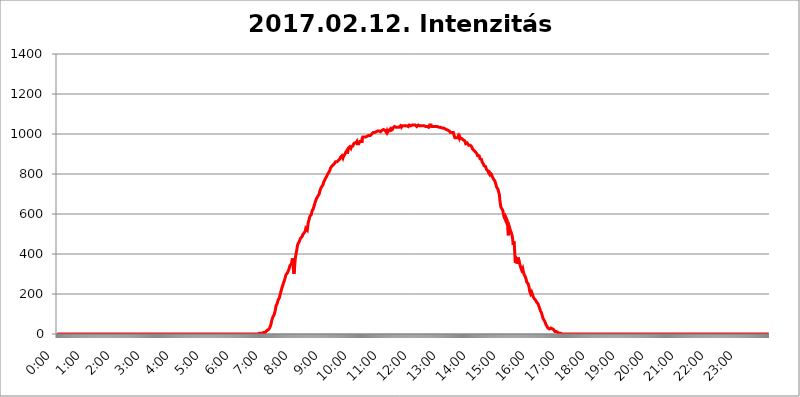
| Category | 2017.02.12. Intenzitás [W/m^2] |
|---|---|
| 0.0 | 0 |
| 0.0006944444444444445 | 0 |
| 0.001388888888888889 | 0 |
| 0.0020833333333333333 | 0 |
| 0.002777777777777778 | 0 |
| 0.003472222222222222 | 0 |
| 0.004166666666666667 | 0 |
| 0.004861111111111111 | 0 |
| 0.005555555555555556 | 0 |
| 0.0062499999999999995 | 0 |
| 0.006944444444444444 | 0 |
| 0.007638888888888889 | 0 |
| 0.008333333333333333 | 0 |
| 0.009027777777777779 | 0 |
| 0.009722222222222222 | 0 |
| 0.010416666666666666 | 0 |
| 0.011111111111111112 | 0 |
| 0.011805555555555555 | 0 |
| 0.012499999999999999 | 0 |
| 0.013194444444444444 | 0 |
| 0.013888888888888888 | 0 |
| 0.014583333333333332 | 0 |
| 0.015277777777777777 | 0 |
| 0.015972222222222224 | 0 |
| 0.016666666666666666 | 0 |
| 0.017361111111111112 | 0 |
| 0.018055555555555557 | 0 |
| 0.01875 | 0 |
| 0.019444444444444445 | 0 |
| 0.02013888888888889 | 0 |
| 0.020833333333333332 | 0 |
| 0.02152777777777778 | 0 |
| 0.022222222222222223 | 0 |
| 0.02291666666666667 | 0 |
| 0.02361111111111111 | 0 |
| 0.024305555555555556 | 0 |
| 0.024999999999999998 | 0 |
| 0.025694444444444447 | 0 |
| 0.02638888888888889 | 0 |
| 0.027083333333333334 | 0 |
| 0.027777777777777776 | 0 |
| 0.02847222222222222 | 0 |
| 0.029166666666666664 | 0 |
| 0.029861111111111113 | 0 |
| 0.030555555555555555 | 0 |
| 0.03125 | 0 |
| 0.03194444444444445 | 0 |
| 0.03263888888888889 | 0 |
| 0.03333333333333333 | 0 |
| 0.034027777777777775 | 0 |
| 0.034722222222222224 | 0 |
| 0.035416666666666666 | 0 |
| 0.036111111111111115 | 0 |
| 0.03680555555555556 | 0 |
| 0.0375 | 0 |
| 0.03819444444444444 | 0 |
| 0.03888888888888889 | 0 |
| 0.03958333333333333 | 0 |
| 0.04027777777777778 | 0 |
| 0.04097222222222222 | 0 |
| 0.041666666666666664 | 0 |
| 0.042361111111111106 | 0 |
| 0.04305555555555556 | 0 |
| 0.043750000000000004 | 0 |
| 0.044444444444444446 | 0 |
| 0.04513888888888889 | 0 |
| 0.04583333333333334 | 0 |
| 0.04652777777777778 | 0 |
| 0.04722222222222222 | 0 |
| 0.04791666666666666 | 0 |
| 0.04861111111111111 | 0 |
| 0.049305555555555554 | 0 |
| 0.049999999999999996 | 0 |
| 0.05069444444444445 | 0 |
| 0.051388888888888894 | 0 |
| 0.052083333333333336 | 0 |
| 0.05277777777777778 | 0 |
| 0.05347222222222222 | 0 |
| 0.05416666666666667 | 0 |
| 0.05486111111111111 | 0 |
| 0.05555555555555555 | 0 |
| 0.05625 | 0 |
| 0.05694444444444444 | 0 |
| 0.057638888888888885 | 0 |
| 0.05833333333333333 | 0 |
| 0.05902777777777778 | 0 |
| 0.059722222222222225 | 0 |
| 0.06041666666666667 | 0 |
| 0.061111111111111116 | 0 |
| 0.06180555555555556 | 0 |
| 0.0625 | 0 |
| 0.06319444444444444 | 0 |
| 0.06388888888888888 | 0 |
| 0.06458333333333334 | 0 |
| 0.06527777777777778 | 0 |
| 0.06597222222222222 | 0 |
| 0.06666666666666667 | 0 |
| 0.06736111111111111 | 0 |
| 0.06805555555555555 | 0 |
| 0.06874999999999999 | 0 |
| 0.06944444444444443 | 0 |
| 0.07013888888888889 | 0 |
| 0.07083333333333333 | 0 |
| 0.07152777777777779 | 0 |
| 0.07222222222222223 | 0 |
| 0.07291666666666667 | 0 |
| 0.07361111111111111 | 0 |
| 0.07430555555555556 | 0 |
| 0.075 | 0 |
| 0.07569444444444444 | 0 |
| 0.0763888888888889 | 0 |
| 0.07708333333333334 | 0 |
| 0.07777777777777778 | 0 |
| 0.07847222222222222 | 0 |
| 0.07916666666666666 | 0 |
| 0.0798611111111111 | 0 |
| 0.08055555555555556 | 0 |
| 0.08125 | 0 |
| 0.08194444444444444 | 0 |
| 0.08263888888888889 | 0 |
| 0.08333333333333333 | 0 |
| 0.08402777777777777 | 0 |
| 0.08472222222222221 | 0 |
| 0.08541666666666665 | 0 |
| 0.08611111111111112 | 0 |
| 0.08680555555555557 | 0 |
| 0.08750000000000001 | 0 |
| 0.08819444444444445 | 0 |
| 0.08888888888888889 | 0 |
| 0.08958333333333333 | 0 |
| 0.09027777777777778 | 0 |
| 0.09097222222222222 | 0 |
| 0.09166666666666667 | 0 |
| 0.09236111111111112 | 0 |
| 0.09305555555555556 | 0 |
| 0.09375 | 0 |
| 0.09444444444444444 | 0 |
| 0.09513888888888888 | 0 |
| 0.09583333333333333 | 0 |
| 0.09652777777777777 | 0 |
| 0.09722222222222222 | 0 |
| 0.09791666666666667 | 0 |
| 0.09861111111111111 | 0 |
| 0.09930555555555555 | 0 |
| 0.09999999999999999 | 0 |
| 0.10069444444444443 | 0 |
| 0.1013888888888889 | 0 |
| 0.10208333333333335 | 0 |
| 0.10277777777777779 | 0 |
| 0.10347222222222223 | 0 |
| 0.10416666666666667 | 0 |
| 0.10486111111111111 | 0 |
| 0.10555555555555556 | 0 |
| 0.10625 | 0 |
| 0.10694444444444444 | 0 |
| 0.1076388888888889 | 0 |
| 0.10833333333333334 | 0 |
| 0.10902777777777778 | 0 |
| 0.10972222222222222 | 0 |
| 0.1111111111111111 | 0 |
| 0.11180555555555556 | 0 |
| 0.11180555555555556 | 0 |
| 0.1125 | 0 |
| 0.11319444444444444 | 0 |
| 0.11388888888888889 | 0 |
| 0.11458333333333333 | 0 |
| 0.11527777777777777 | 0 |
| 0.11597222222222221 | 0 |
| 0.11666666666666665 | 0 |
| 0.1173611111111111 | 0 |
| 0.11805555555555557 | 0 |
| 0.11944444444444445 | 0 |
| 0.12013888888888889 | 0 |
| 0.12083333333333333 | 0 |
| 0.12152777777777778 | 0 |
| 0.12222222222222223 | 0 |
| 0.12291666666666667 | 0 |
| 0.12291666666666667 | 0 |
| 0.12361111111111112 | 0 |
| 0.12430555555555556 | 0 |
| 0.125 | 0 |
| 0.12569444444444444 | 0 |
| 0.12638888888888888 | 0 |
| 0.12708333333333333 | 0 |
| 0.16875 | 0 |
| 0.12847222222222224 | 0 |
| 0.12916666666666668 | 0 |
| 0.12986111111111112 | 0 |
| 0.13055555555555556 | 0 |
| 0.13125 | 0 |
| 0.13194444444444445 | 0 |
| 0.1326388888888889 | 0 |
| 0.13333333333333333 | 0 |
| 0.13402777777777777 | 0 |
| 0.13402777777777777 | 0 |
| 0.13472222222222222 | 0 |
| 0.13541666666666666 | 0 |
| 0.1361111111111111 | 0 |
| 0.13749999999999998 | 0 |
| 0.13819444444444443 | 0 |
| 0.1388888888888889 | 0 |
| 0.13958333333333334 | 0 |
| 0.14027777777777778 | 0 |
| 0.14097222222222222 | 0 |
| 0.14166666666666666 | 0 |
| 0.1423611111111111 | 0 |
| 0.14305555555555557 | 0 |
| 0.14375000000000002 | 0 |
| 0.14444444444444446 | 0 |
| 0.1451388888888889 | 0 |
| 0.1451388888888889 | 0 |
| 0.14652777777777778 | 0 |
| 0.14722222222222223 | 0 |
| 0.14791666666666667 | 0 |
| 0.1486111111111111 | 0 |
| 0.14930555555555555 | 0 |
| 0.15 | 0 |
| 0.15069444444444444 | 0 |
| 0.15138888888888888 | 0 |
| 0.15208333333333332 | 0 |
| 0.15277777777777776 | 0 |
| 0.15347222222222223 | 0 |
| 0.15416666666666667 | 0 |
| 0.15486111111111112 | 0 |
| 0.15555555555555556 | 0 |
| 0.15625 | 0 |
| 0.15694444444444444 | 0 |
| 0.15763888888888888 | 0 |
| 0.15833333333333333 | 0 |
| 0.15902777777777777 | 0 |
| 0.15972222222222224 | 0 |
| 0.16041666666666668 | 0 |
| 0.16111111111111112 | 0 |
| 0.16180555555555556 | 0 |
| 0.1625 | 0 |
| 0.16319444444444445 | 0 |
| 0.1638888888888889 | 0 |
| 0.16458333333333333 | 0 |
| 0.16527777777777777 | 0 |
| 0.16597222222222222 | 0 |
| 0.16666666666666666 | 0 |
| 0.1673611111111111 | 0 |
| 0.16805555555555554 | 0 |
| 0.16874999999999998 | 0 |
| 0.16944444444444443 | 0 |
| 0.17013888888888887 | 0 |
| 0.1708333333333333 | 0 |
| 0.17152777777777775 | 0 |
| 0.17222222222222225 | 0 |
| 0.1729166666666667 | 0 |
| 0.17361111111111113 | 0 |
| 0.17430555555555557 | 0 |
| 0.17500000000000002 | 0 |
| 0.17569444444444446 | 0 |
| 0.1763888888888889 | 0 |
| 0.17708333333333334 | 0 |
| 0.17777777777777778 | 0 |
| 0.17847222222222223 | 0 |
| 0.17916666666666667 | 0 |
| 0.1798611111111111 | 0 |
| 0.18055555555555555 | 0 |
| 0.18125 | 0 |
| 0.18194444444444444 | 0 |
| 0.1826388888888889 | 0 |
| 0.18333333333333335 | 0 |
| 0.1840277777777778 | 0 |
| 0.18472222222222223 | 0 |
| 0.18541666666666667 | 0 |
| 0.18611111111111112 | 0 |
| 0.18680555555555556 | 0 |
| 0.1875 | 0 |
| 0.18819444444444444 | 0 |
| 0.18888888888888888 | 0 |
| 0.18958333333333333 | 0 |
| 0.19027777777777777 | 0 |
| 0.1909722222222222 | 0 |
| 0.19166666666666665 | 0 |
| 0.19236111111111112 | 0 |
| 0.19305555555555554 | 0 |
| 0.19375 | 0 |
| 0.19444444444444445 | 0 |
| 0.1951388888888889 | 0 |
| 0.19583333333333333 | 0 |
| 0.19652777777777777 | 0 |
| 0.19722222222222222 | 0 |
| 0.19791666666666666 | 0 |
| 0.1986111111111111 | 0 |
| 0.19930555555555554 | 0 |
| 0.19999999999999998 | 0 |
| 0.20069444444444443 | 0 |
| 0.20138888888888887 | 0 |
| 0.2020833333333333 | 0 |
| 0.2027777777777778 | 0 |
| 0.2034722222222222 | 0 |
| 0.2041666666666667 | 0 |
| 0.20486111111111113 | 0 |
| 0.20555555555555557 | 0 |
| 0.20625000000000002 | 0 |
| 0.20694444444444446 | 0 |
| 0.2076388888888889 | 0 |
| 0.20833333333333334 | 0 |
| 0.20902777777777778 | 0 |
| 0.20972222222222223 | 0 |
| 0.21041666666666667 | 0 |
| 0.2111111111111111 | 0 |
| 0.21180555555555555 | 0 |
| 0.2125 | 0 |
| 0.21319444444444444 | 0 |
| 0.2138888888888889 | 0 |
| 0.21458333333333335 | 0 |
| 0.2152777777777778 | 0 |
| 0.21597222222222223 | 0 |
| 0.21666666666666667 | 0 |
| 0.21736111111111112 | 0 |
| 0.21805555555555556 | 0 |
| 0.21875 | 0 |
| 0.21944444444444444 | 0 |
| 0.22013888888888888 | 0 |
| 0.22083333333333333 | 0 |
| 0.22152777777777777 | 0 |
| 0.2222222222222222 | 0 |
| 0.22291666666666665 | 0 |
| 0.2236111111111111 | 0 |
| 0.22430555555555556 | 0 |
| 0.225 | 0 |
| 0.22569444444444445 | 0 |
| 0.2263888888888889 | 0 |
| 0.22708333333333333 | 0 |
| 0.22777777777777777 | 0 |
| 0.22847222222222222 | 0 |
| 0.22916666666666666 | 0 |
| 0.2298611111111111 | 0 |
| 0.23055555555555554 | 0 |
| 0.23124999999999998 | 0 |
| 0.23194444444444443 | 0 |
| 0.23263888888888887 | 0 |
| 0.2333333333333333 | 0 |
| 0.2340277777777778 | 0 |
| 0.2347222222222222 | 0 |
| 0.2354166666666667 | 0 |
| 0.23611111111111113 | 0 |
| 0.23680555555555557 | 0 |
| 0.23750000000000002 | 0 |
| 0.23819444444444446 | 0 |
| 0.2388888888888889 | 0 |
| 0.23958333333333334 | 0 |
| 0.24027777777777778 | 0 |
| 0.24097222222222223 | 0 |
| 0.24166666666666667 | 0 |
| 0.2423611111111111 | 0 |
| 0.24305555555555555 | 0 |
| 0.24375 | 0 |
| 0.24444444444444446 | 0 |
| 0.24513888888888888 | 0 |
| 0.24583333333333335 | 0 |
| 0.2465277777777778 | 0 |
| 0.24722222222222223 | 0 |
| 0.24791666666666667 | 0 |
| 0.24861111111111112 | 0 |
| 0.24930555555555556 | 0 |
| 0.25 | 0 |
| 0.25069444444444444 | 0 |
| 0.2513888888888889 | 0 |
| 0.2520833333333333 | 0 |
| 0.25277777777777777 | 0 |
| 0.2534722222222222 | 0 |
| 0.25416666666666665 | 0 |
| 0.2548611111111111 | 0 |
| 0.2555555555555556 | 0 |
| 0.25625000000000003 | 0 |
| 0.2569444444444445 | 0 |
| 0.2576388888888889 | 0 |
| 0.25833333333333336 | 0 |
| 0.2590277777777778 | 0 |
| 0.25972222222222224 | 0 |
| 0.2604166666666667 | 0 |
| 0.2611111111111111 | 0 |
| 0.26180555555555557 | 0 |
| 0.2625 | 0 |
| 0.26319444444444445 | 0 |
| 0.2638888888888889 | 0 |
| 0.26458333333333334 | 0 |
| 0.2652777777777778 | 0 |
| 0.2659722222222222 | 0 |
| 0.26666666666666666 | 0 |
| 0.2673611111111111 | 0 |
| 0.26805555555555555 | 0 |
| 0.26875 | 0 |
| 0.26944444444444443 | 0 |
| 0.2701388888888889 | 0 |
| 0.2708333333333333 | 0 |
| 0.27152777777777776 | 0 |
| 0.2722222222222222 | 0 |
| 0.27291666666666664 | 0 |
| 0.2736111111111111 | 0 |
| 0.2743055555555555 | 0 |
| 0.27499999999999997 | 0 |
| 0.27569444444444446 | 0 |
| 0.27638888888888885 | 0 |
| 0.27708333333333335 | 0 |
| 0.2777777777777778 | 0 |
| 0.27847222222222223 | 0 |
| 0.2791666666666667 | 0 |
| 0.2798611111111111 | 0 |
| 0.28055555555555556 | 0 |
| 0.28125 | 0 |
| 0.28194444444444444 | 3.525 |
| 0.2826388888888889 | 3.525 |
| 0.2833333333333333 | 3.525 |
| 0.28402777777777777 | 3.525 |
| 0.2847222222222222 | 3.525 |
| 0.28541666666666665 | 3.525 |
| 0.28611111111111115 | 3.525 |
| 0.28680555555555554 | 3.525 |
| 0.28750000000000003 | 3.525 |
| 0.2881944444444445 | 3.525 |
| 0.2888888888888889 | 3.525 |
| 0.28958333333333336 | 7.887 |
| 0.2902777777777778 | 7.887 |
| 0.29097222222222224 | 7.887 |
| 0.2916666666666667 | 7.887 |
| 0.2923611111111111 | 12.257 |
| 0.29305555555555557 | 12.257 |
| 0.29375 | 16.636 |
| 0.29444444444444445 | 16.636 |
| 0.2951388888888889 | 16.636 |
| 0.29583333333333334 | 21.024 |
| 0.2965277777777778 | 25.419 |
| 0.2972222222222222 | 25.419 |
| 0.29791666666666666 | 29.823 |
| 0.2986111111111111 | 29.823 |
| 0.29930555555555555 | 34.234 |
| 0.3 | 51.951 |
| 0.30069444444444443 | 65.31 |
| 0.3013888888888889 | 74.246 |
| 0.3020833333333333 | 78.722 |
| 0.30277777777777776 | 87.692 |
| 0.3034722222222222 | 92.184 |
| 0.30416666666666664 | 96.682 |
| 0.3048611111111111 | 105.69 |
| 0.3055555555555555 | 114.716 |
| 0.30624999999999997 | 128.284 |
| 0.3069444444444444 | 141.884 |
| 0.3076388888888889 | 146.423 |
| 0.30833333333333335 | 150.964 |
| 0.3090277777777778 | 160.056 |
| 0.30972222222222223 | 169.156 |
| 0.3104166666666667 | 164.605 |
| 0.3111111111111111 | 169.156 |
| 0.31180555555555556 | 182.82 |
| 0.3125 | 196.497 |
| 0.31319444444444444 | 205.62 |
| 0.3138888888888889 | 210.182 |
| 0.3145833333333333 | 223.873 |
| 0.31527777777777777 | 233 |
| 0.3159722222222222 | 237.564 |
| 0.31666666666666665 | 246.689 |
| 0.31736111111111115 | 255.813 |
| 0.31805555555555554 | 260.373 |
| 0.31875000000000003 | 269.49 |
| 0.3194444444444445 | 278.603 |
| 0.3201388888888889 | 287.709 |
| 0.32083333333333336 | 296.808 |
| 0.3215277777777778 | 296.808 |
| 0.32222222222222224 | 301.354 |
| 0.3229166666666667 | 305.898 |
| 0.3236111111111111 | 305.898 |
| 0.32430555555555557 | 310.44 |
| 0.325 | 324.052 |
| 0.32569444444444445 | 333.113 |
| 0.3263888888888889 | 342.162 |
| 0.32708333333333334 | 342.162 |
| 0.3277777777777778 | 342.162 |
| 0.3284722222222222 | 351.198 |
| 0.32916666666666666 | 364.728 |
| 0.3298611111111111 | 378.224 |
| 0.33055555555555555 | 364.728 |
| 0.33125 | 319.517 |
| 0.33194444444444443 | 301.354 |
| 0.3326388888888889 | 319.517 |
| 0.3333333333333333 | 355.712 |
| 0.3340277777777778 | 382.715 |
| 0.3347222222222222 | 396.164 |
| 0.3354166666666667 | 409.574 |
| 0.3361111111111111 | 422.943 |
| 0.3368055555555556 | 440.702 |
| 0.33749999999999997 | 449.551 |
| 0.33819444444444446 | 453.968 |
| 0.33888888888888885 | 453.968 |
| 0.33958333333333335 | 462.786 |
| 0.34027777777777773 | 471.582 |
| 0.34097222222222223 | 475.972 |
| 0.3416666666666666 | 480.356 |
| 0.3423611111111111 | 480.356 |
| 0.3430555555555555 | 484.735 |
| 0.34375 | 489.108 |
| 0.3444444444444445 | 497.836 |
| 0.3451388888888889 | 502.192 |
| 0.3458333333333334 | 502.192 |
| 0.34652777777777777 | 506.542 |
| 0.34722222222222227 | 506.542 |
| 0.34791666666666665 | 515.223 |
| 0.34861111111111115 | 528.2 |
| 0.34930555555555554 | 532.513 |
| 0.35000000000000003 | 523.88 |
| 0.3506944444444444 | 519.555 |
| 0.3513888888888889 | 541.121 |
| 0.3520833333333333 | 558.261 |
| 0.3527777777777778 | 566.793 |
| 0.3534722222222222 | 575.299 |
| 0.3541666666666667 | 588.009 |
| 0.3548611111111111 | 592.233 |
| 0.35555555555555557 | 588.009 |
| 0.35625 | 596.45 |
| 0.35694444444444445 | 609.062 |
| 0.3576388888888889 | 617.436 |
| 0.35833333333333334 | 621.613 |
| 0.3590277777777778 | 625.784 |
| 0.3597222222222222 | 634.105 |
| 0.36041666666666666 | 642.4 |
| 0.3611111111111111 | 650.667 |
| 0.36180555555555555 | 658.909 |
| 0.3625 | 667.123 |
| 0.36319444444444443 | 671.22 |
| 0.3638888888888889 | 679.395 |
| 0.3645833333333333 | 683.473 |
| 0.3652777777777778 | 687.544 |
| 0.3659722222222222 | 687.544 |
| 0.3666666666666667 | 691.608 |
| 0.3673611111111111 | 699.717 |
| 0.3680555555555556 | 711.832 |
| 0.36874999999999997 | 719.877 |
| 0.36944444444444446 | 723.889 |
| 0.37013888888888885 | 731.896 |
| 0.37083333333333335 | 735.89 |
| 0.37152777777777773 | 739.877 |
| 0.37222222222222223 | 743.859 |
| 0.3729166666666666 | 747.834 |
| 0.3736111111111111 | 759.723 |
| 0.3743055555555555 | 763.674 |
| 0.375 | 767.62 |
| 0.3756944444444445 | 775.492 |
| 0.3763888888888889 | 775.492 |
| 0.3770833333333334 | 779.42 |
| 0.37777777777777777 | 787.258 |
| 0.37847222222222227 | 791.169 |
| 0.37916666666666665 | 798.974 |
| 0.37986111111111115 | 795.074 |
| 0.38055555555555554 | 806.757 |
| 0.38125000000000003 | 806.757 |
| 0.3819444444444444 | 814.519 |
| 0.3826388888888889 | 822.26 |
| 0.3833333333333333 | 829.981 |
| 0.3840277777777778 | 829.981 |
| 0.3847222222222222 | 837.682 |
| 0.3854166666666667 | 841.526 |
| 0.3861111111111111 | 841.526 |
| 0.38680555555555557 | 845.365 |
| 0.3875 | 845.365 |
| 0.38819444444444445 | 849.199 |
| 0.3888888888888889 | 853.029 |
| 0.38958333333333334 | 853.029 |
| 0.3902777777777778 | 860.676 |
| 0.3909722222222222 | 860.676 |
| 0.39166666666666666 | 860.676 |
| 0.3923611111111111 | 860.676 |
| 0.39305555555555555 | 860.676 |
| 0.39375 | 860.676 |
| 0.39444444444444443 | 868.305 |
| 0.3951388888888889 | 868.305 |
| 0.3958333333333333 | 868.305 |
| 0.3965277777777778 | 875.918 |
| 0.3972222222222222 | 883.516 |
| 0.3979166666666667 | 887.309 |
| 0.3986111111111111 | 887.309 |
| 0.3993055555555556 | 891.099 |
| 0.39999999999999997 | 894.885 |
| 0.40069444444444446 | 879.719 |
| 0.40138888888888885 | 887.309 |
| 0.40208333333333335 | 891.099 |
| 0.40277777777777773 | 894.885 |
| 0.40347222222222223 | 898.668 |
| 0.4041666666666666 | 898.668 |
| 0.4048611111111111 | 909.996 |
| 0.4055555555555555 | 913.766 |
| 0.40625 | 917.534 |
| 0.4069444444444445 | 902.447 |
| 0.4076388888888889 | 913.766 |
| 0.4083333333333334 | 928.819 |
| 0.40902777777777777 | 932.576 |
| 0.40972222222222227 | 932.576 |
| 0.41041666666666665 | 936.33 |
| 0.41111111111111115 | 936.33 |
| 0.41180555555555554 | 928.819 |
| 0.41250000000000003 | 936.33 |
| 0.4131944444444444 | 936.33 |
| 0.4138888888888889 | 936.33 |
| 0.4145833333333333 | 940.082 |
| 0.4152777777777778 | 947.58 |
| 0.4159722222222222 | 951.327 |
| 0.4166666666666667 | 955.071 |
| 0.4173611111111111 | 955.071 |
| 0.41805555555555557 | 955.071 |
| 0.41875 | 955.071 |
| 0.41944444444444445 | 958.814 |
| 0.4201388888888889 | 962.555 |
| 0.42083333333333334 | 951.327 |
| 0.4215277777777778 | 951.327 |
| 0.4222222222222222 | 947.58 |
| 0.42291666666666666 | 951.327 |
| 0.4236111111111111 | 955.071 |
| 0.42430555555555555 | 962.555 |
| 0.425 | 962.555 |
| 0.42569444444444443 | 962.555 |
| 0.4263888888888889 | 962.555 |
| 0.4270833333333333 | 955.071 |
| 0.4277777777777778 | 977.508 |
| 0.4284722222222222 | 984.98 |
| 0.4291666666666667 | 988.714 |
| 0.4298611111111111 | 984.98 |
| 0.4305555555555556 | 984.98 |
| 0.43124999999999997 | 981.244 |
| 0.43194444444444446 | 984.98 |
| 0.43263888888888885 | 984.98 |
| 0.43333333333333335 | 984.98 |
| 0.43402777777777773 | 988.714 |
| 0.43472222222222223 | 988.714 |
| 0.4354166666666666 | 988.714 |
| 0.4361111111111111 | 988.714 |
| 0.4368055555555555 | 992.448 |
| 0.4375 | 992.448 |
| 0.4381944444444445 | 992.448 |
| 0.4388888888888889 | 992.448 |
| 0.4395833333333334 | 992.448 |
| 0.44027777777777777 | 996.182 |
| 0.44097222222222227 | 999.916 |
| 0.44166666666666665 | 999.916 |
| 0.44236111111111115 | 1003.65 |
| 0.44305555555555554 | 1007.383 |
| 0.44375000000000003 | 1007.383 |
| 0.4444444444444444 | 1007.383 |
| 0.4451388888888889 | 1007.383 |
| 0.4458333333333333 | 1007.383 |
| 0.4465277777777778 | 1007.383 |
| 0.4472222222222222 | 1011.118 |
| 0.4479166666666667 | 1011.118 |
| 0.4486111111111111 | 1011.118 |
| 0.44930555555555557 | 1014.852 |
| 0.45 | 1014.852 |
| 0.45069444444444445 | 1014.852 |
| 0.4513888888888889 | 1014.852 |
| 0.45208333333333334 | 1011.118 |
| 0.4527777777777778 | 1011.118 |
| 0.4534722222222222 | 1011.118 |
| 0.45416666666666666 | 1014.852 |
| 0.4548611111111111 | 1014.852 |
| 0.45555555555555555 | 1018.587 |
| 0.45625 | 1018.587 |
| 0.45694444444444443 | 1022.323 |
| 0.4576388888888889 | 1022.323 |
| 0.4583333333333333 | 1018.587 |
| 0.4590277777777778 | 1018.587 |
| 0.4597222222222222 | 1018.587 |
| 0.4604166666666667 | 1014.852 |
| 0.4611111111111111 | 1014.852 |
| 0.4618055555555556 | 1007.383 |
| 0.46249999999999997 | 1014.852 |
| 0.46319444444444446 | 1007.383 |
| 0.46388888888888885 | 1007.383 |
| 0.46458333333333335 | 1011.118 |
| 0.46527777777777773 | 1018.587 |
| 0.46597222222222223 | 1022.323 |
| 0.4666666666666666 | 1022.323 |
| 0.4673611111111111 | 1026.06 |
| 0.4680555555555555 | 1018.587 |
| 0.46875 | 1022.323 |
| 0.4694444444444445 | 1022.323 |
| 0.4701388888888889 | 1022.323 |
| 0.4708333333333334 | 1029.798 |
| 0.47152777777777777 | 1029.798 |
| 0.47222222222222227 | 1033.537 |
| 0.47291666666666665 | 1037.277 |
| 0.47361111111111115 | 1033.537 |
| 0.47430555555555554 | 1033.537 |
| 0.47500000000000003 | 1033.537 |
| 0.4756944444444444 | 1033.537 |
| 0.4763888888888889 | 1033.537 |
| 0.4770833333333333 | 1033.537 |
| 0.4777777777777778 | 1033.537 |
| 0.4784722222222222 | 1033.537 |
| 0.4791666666666667 | 1033.537 |
| 0.4798611111111111 | 1037.277 |
| 0.48055555555555557 | 1029.798 |
| 0.48125 | 1041.019 |
| 0.48194444444444445 | 1037.277 |
| 0.4826388888888889 | 1033.537 |
| 0.48333333333333334 | 1037.277 |
| 0.4840277777777778 | 1041.019 |
| 0.4847222222222222 | 1037.277 |
| 0.48541666666666666 | 1037.277 |
| 0.4861111111111111 | 1041.019 |
| 0.48680555555555555 | 1037.277 |
| 0.4875 | 1037.277 |
| 0.48819444444444443 | 1041.019 |
| 0.4888888888888889 | 1037.277 |
| 0.4895833333333333 | 1037.277 |
| 0.4902777777777778 | 1041.019 |
| 0.4909722222222222 | 1037.277 |
| 0.4916666666666667 | 1037.277 |
| 0.4923611111111111 | 1037.277 |
| 0.4930555555555556 | 1037.277 |
| 0.49374999999999997 | 1044.762 |
| 0.49444444444444446 | 1044.762 |
| 0.49513888888888885 | 1044.762 |
| 0.49583333333333335 | 1041.019 |
| 0.49652777777777773 | 1041.019 |
| 0.49722222222222223 | 1041.019 |
| 0.4979166666666666 | 1044.762 |
| 0.4986111111111111 | 1044.762 |
| 0.4993055555555555 | 1044.762 |
| 0.5 | 1044.762 |
| 0.5006944444444444 | 1044.762 |
| 0.5013888888888889 | 1044.762 |
| 0.5020833333333333 | 1044.762 |
| 0.5027777777777778 | 1048.508 |
| 0.5034722222222222 | 1044.762 |
| 0.5041666666666667 | 1037.277 |
| 0.5048611111111111 | 1041.019 |
| 0.5055555555555555 | 1041.019 |
| 0.50625 | 1044.762 |
| 0.5069444444444444 | 1044.762 |
| 0.5076388888888889 | 1044.762 |
| 0.5083333333333333 | 1041.019 |
| 0.5090277777777777 | 1044.762 |
| 0.5097222222222222 | 1044.762 |
| 0.5104166666666666 | 1041.019 |
| 0.5111111111111112 | 1041.019 |
| 0.5118055555555555 | 1041.019 |
| 0.5125000000000001 | 1041.019 |
| 0.5131944444444444 | 1041.019 |
| 0.513888888888889 | 1044.762 |
| 0.5145833333333333 | 1041.019 |
| 0.5152777777777778 | 1041.019 |
| 0.5159722222222222 | 1041.019 |
| 0.5166666666666667 | 1037.277 |
| 0.517361111111111 | 1037.277 |
| 0.5180555555555556 | 1041.019 |
| 0.5187499999999999 | 1037.277 |
| 0.5194444444444445 | 1037.277 |
| 0.5201388888888888 | 1033.537 |
| 0.5208333333333334 | 1033.537 |
| 0.5215277777777778 | 1033.537 |
| 0.5222222222222223 | 1044.762 |
| 0.5229166666666667 | 1044.762 |
| 0.5236111111111111 | 1044.762 |
| 0.5243055555555556 | 1044.762 |
| 0.525 | 1037.277 |
| 0.5256944444444445 | 1037.277 |
| 0.5263888888888889 | 1037.277 |
| 0.5270833333333333 | 1037.277 |
| 0.5277777777777778 | 1037.277 |
| 0.5284722222222222 | 1037.277 |
| 0.5291666666666667 | 1037.277 |
| 0.5298611111111111 | 1037.277 |
| 0.5305555555555556 | 1037.277 |
| 0.53125 | 1037.277 |
| 0.5319444444444444 | 1037.277 |
| 0.5326388888888889 | 1033.537 |
| 0.5333333333333333 | 1037.277 |
| 0.5340277777777778 | 1037.277 |
| 0.5347222222222222 | 1033.537 |
| 0.5354166666666667 | 1033.537 |
| 0.5361111111111111 | 1037.277 |
| 0.5368055555555555 | 1037.277 |
| 0.5375 | 1033.537 |
| 0.5381944444444444 | 1029.798 |
| 0.5388888888888889 | 1029.798 |
| 0.5395833333333333 | 1029.798 |
| 0.5402777777777777 | 1026.06 |
| 0.5409722222222222 | 1029.798 |
| 0.5416666666666666 | 1029.798 |
| 0.5423611111111112 | 1026.06 |
| 0.5430555555555555 | 1026.06 |
| 0.5437500000000001 | 1026.06 |
| 0.5444444444444444 | 1026.06 |
| 0.545138888888889 | 1026.06 |
| 0.5458333333333333 | 1022.323 |
| 0.5465277777777778 | 1022.323 |
| 0.5472222222222222 | 1022.323 |
| 0.5479166666666667 | 1018.587 |
| 0.548611111111111 | 1014.852 |
| 0.5493055555555556 | 1014.852 |
| 0.5499999999999999 | 1014.852 |
| 0.5506944444444445 | 1011.118 |
| 0.5513888888888888 | 1007.383 |
| 0.5520833333333334 | 1007.383 |
| 0.5527777777777778 | 1007.383 |
| 0.5534722222222223 | 1007.383 |
| 0.5541666666666667 | 1007.383 |
| 0.5548611111111111 | 1011.118 |
| 0.5555555555555556 | 1007.383 |
| 0.55625 | 996.182 |
| 0.5569444444444445 | 988.714 |
| 0.5576388888888889 | 981.244 |
| 0.5583333333333333 | 984.98 |
| 0.5590277777777778 | 981.244 |
| 0.5597222222222222 | 981.244 |
| 0.5604166666666667 | 984.98 |
| 0.5611111111111111 | 977.508 |
| 0.5618055555555556 | 981.244 |
| 0.5625 | 988.714 |
| 0.5631944444444444 | 992.448 |
| 0.5638888888888889 | 977.508 |
| 0.5645833333333333 | 984.98 |
| 0.5652777777777778 | 977.508 |
| 0.5659722222222222 | 977.508 |
| 0.5666666666666667 | 973.772 |
| 0.5673611111111111 | 977.508 |
| 0.5680555555555555 | 977.508 |
| 0.56875 | 977.508 |
| 0.5694444444444444 | 970.034 |
| 0.5701388888888889 | 970.034 |
| 0.5708333333333333 | 966.295 |
| 0.5715277777777777 | 966.295 |
| 0.5722222222222222 | 962.555 |
| 0.5729166666666666 | 951.327 |
| 0.5736111111111112 | 947.58 |
| 0.5743055555555555 | 947.58 |
| 0.5750000000000001 | 955.071 |
| 0.5756944444444444 | 951.327 |
| 0.576388888888889 | 955.071 |
| 0.5770833333333333 | 943.832 |
| 0.5777777777777778 | 947.58 |
| 0.5784722222222222 | 943.832 |
| 0.5791666666666667 | 943.832 |
| 0.579861111111111 | 940.082 |
| 0.5805555555555556 | 940.082 |
| 0.5812499999999999 | 936.33 |
| 0.5819444444444445 | 928.819 |
| 0.5826388888888888 | 925.06 |
| 0.5833333333333334 | 921.298 |
| 0.5840277777777778 | 917.534 |
| 0.5847222222222223 | 917.534 |
| 0.5854166666666667 | 913.766 |
| 0.5861111111111111 | 909.996 |
| 0.5868055555555556 | 909.996 |
| 0.5875 | 906.223 |
| 0.5881944444444445 | 906.223 |
| 0.5888888888888889 | 898.668 |
| 0.5895833333333333 | 891.099 |
| 0.5902777777777778 | 891.099 |
| 0.5909722222222222 | 891.099 |
| 0.5916666666666667 | 891.099 |
| 0.5923611111111111 | 883.516 |
| 0.5930555555555556 | 875.918 |
| 0.59375 | 875.918 |
| 0.5944444444444444 | 875.918 |
| 0.5951388888888889 | 872.114 |
| 0.5958333333333333 | 860.676 |
| 0.5965277777777778 | 856.855 |
| 0.5972222222222222 | 853.029 |
| 0.5979166666666667 | 849.199 |
| 0.5986111111111111 | 841.526 |
| 0.5993055555555555 | 845.365 |
| 0.6 | 837.682 |
| 0.6006944444444444 | 837.682 |
| 0.6013888888888889 | 833.834 |
| 0.6020833333333333 | 822.26 |
| 0.6027777777777777 | 818.392 |
| 0.6034722222222222 | 818.392 |
| 0.6041666666666666 | 814.519 |
| 0.6048611111111112 | 806.757 |
| 0.6055555555555555 | 802.868 |
| 0.6062500000000001 | 798.974 |
| 0.6069444444444444 | 806.757 |
| 0.607638888888889 | 810.641 |
| 0.6083333333333333 | 806.757 |
| 0.6090277777777778 | 798.974 |
| 0.6097222222222222 | 791.169 |
| 0.6104166666666667 | 787.258 |
| 0.611111111111111 | 779.42 |
| 0.6118055555555556 | 779.42 |
| 0.6124999999999999 | 771.559 |
| 0.6131944444444445 | 767.62 |
| 0.6138888888888888 | 763.674 |
| 0.6145833333333334 | 755.766 |
| 0.6152777777777778 | 747.834 |
| 0.6159722222222223 | 735.89 |
| 0.6166666666666667 | 739.877 |
| 0.6173611111111111 | 731.896 |
| 0.6180555555555556 | 723.889 |
| 0.61875 | 719.877 |
| 0.6194444444444445 | 719.877 |
| 0.6201388888888889 | 695.666 |
| 0.6208333333333333 | 667.123 |
| 0.6215277777777778 | 650.667 |
| 0.6222222222222222 | 634.105 |
| 0.6229166666666667 | 629.948 |
| 0.6236111111111111 | 625.784 |
| 0.6243055555555556 | 625.784 |
| 0.625 | 617.436 |
| 0.6256944444444444 | 600.661 |
| 0.6263888888888889 | 588.009 |
| 0.6270833333333333 | 592.233 |
| 0.6277777777777778 | 592.233 |
| 0.6284722222222222 | 571.049 |
| 0.6291666666666667 | 583.779 |
| 0.6298611111111111 | 579.542 |
| 0.6305555555555555 | 583.779 |
| 0.63125 | 566.793 |
| 0.6319444444444444 | 523.88 |
| 0.6326388888888889 | 493.475 |
| 0.6333333333333333 | 528.2 |
| 0.6340277777777777 | 536.82 |
| 0.6347222222222222 | 532.513 |
| 0.6354166666666666 | 519.555 |
| 0.6361111111111112 | 519.555 |
| 0.6368055555555555 | 506.542 |
| 0.6375000000000001 | 506.542 |
| 0.6381944444444444 | 489.108 |
| 0.638888888888889 | 467.187 |
| 0.6395833333333333 | 445.129 |
| 0.6402777777777778 | 462.786 |
| 0.6409722222222222 | 453.968 |
| 0.6416666666666667 | 405.108 |
| 0.642361111111111 | 355.712 |
| 0.6430555555555556 | 351.198 |
| 0.6437499999999999 | 369.23 |
| 0.6444444444444445 | 360.221 |
| 0.6451388888888888 | 351.198 |
| 0.6458333333333334 | 369.23 |
| 0.6465277777777778 | 382.715 |
| 0.6472222222222223 | 382.715 |
| 0.6479166666666667 | 360.221 |
| 0.6486111111111111 | 360.221 |
| 0.6493055555555556 | 360.221 |
| 0.65 | 333.113 |
| 0.6506944444444445 | 328.584 |
| 0.6513888888888889 | 319.517 |
| 0.6520833333333333 | 324.052 |
| 0.6527777777777778 | 328.584 |
| 0.6534722222222222 | 314.98 |
| 0.6541666666666667 | 305.898 |
| 0.6548611111111111 | 296.808 |
| 0.6555555555555556 | 296.808 |
| 0.65625 | 287.709 |
| 0.6569444444444444 | 292.259 |
| 0.6576388888888889 | 274.047 |
| 0.6583333333333333 | 260.373 |
| 0.6590277777777778 | 260.373 |
| 0.6597222222222222 | 260.373 |
| 0.6604166666666667 | 251.251 |
| 0.6611111111111111 | 242.127 |
| 0.6618055555555555 | 233 |
| 0.6625 | 214.746 |
| 0.6631944444444444 | 210.182 |
| 0.6638888888888889 | 201.058 |
| 0.6645833333333333 | 205.62 |
| 0.6652777777777777 | 210.182 |
| 0.6659722222222222 | 210.182 |
| 0.6666666666666666 | 196.497 |
| 0.6673611111111111 | 187.378 |
| 0.6680555555555556 | 191.937 |
| 0.6687500000000001 | 178.264 |
| 0.6694444444444444 | 173.709 |
| 0.6701388888888888 | 173.709 |
| 0.6708333333333334 | 169.156 |
| 0.6715277777777778 | 164.605 |
| 0.6722222222222222 | 160.056 |
| 0.6729166666666666 | 155.509 |
| 0.6736111111111112 | 155.509 |
| 0.6743055555555556 | 150.964 |
| 0.6749999999999999 | 146.423 |
| 0.6756944444444444 | 137.347 |
| 0.6763888888888889 | 132.814 |
| 0.6770833333333334 | 123.758 |
| 0.6777777777777777 | 114.716 |
| 0.6784722222222223 | 110.201 |
| 0.6791666666666667 | 105.69 |
| 0.6798611111111111 | 101.184 |
| 0.6805555555555555 | 87.692 |
| 0.68125 | 78.722 |
| 0.6819444444444445 | 74.246 |
| 0.6826388888888889 | 69.775 |
| 0.6833333333333332 | 65.31 |
| 0.6840277777777778 | 60.85 |
| 0.6847222222222222 | 56.398 |
| 0.6854166666666667 | 47.511 |
| 0.686111111111111 | 43.079 |
| 0.6868055555555556 | 38.653 |
| 0.6875 | 34.234 |
| 0.6881944444444444 | 29.823 |
| 0.688888888888889 | 29.823 |
| 0.6895833333333333 | 25.419 |
| 0.6902777777777778 | 25.419 |
| 0.6909722222222222 | 25.419 |
| 0.6916666666666668 | 29.823 |
| 0.6923611111111111 | 29.823 |
| 0.6930555555555555 | 29.823 |
| 0.69375 | 25.419 |
| 0.6944444444444445 | 25.419 |
| 0.6951388888888889 | 25.419 |
| 0.6958333333333333 | 21.024 |
| 0.6965277777777777 | 21.024 |
| 0.6972222222222223 | 16.636 |
| 0.6979166666666666 | 12.257 |
| 0.6986111111111111 | 12.257 |
| 0.6993055555555556 | 12.257 |
| 0.7000000000000001 | 12.257 |
| 0.7006944444444444 | 7.887 |
| 0.7013888888888888 | 7.887 |
| 0.7020833333333334 | 7.887 |
| 0.7027777777777778 | 7.887 |
| 0.7034722222222222 | 3.525 |
| 0.7041666666666666 | 3.525 |
| 0.7048611111111112 | 3.525 |
| 0.7055555555555556 | 3.525 |
| 0.7062499999999999 | 3.525 |
| 0.7069444444444444 | 3.525 |
| 0.7076388888888889 | 3.525 |
| 0.7083333333333334 | 0 |
| 0.7090277777777777 | 0 |
| 0.7097222222222223 | 0 |
| 0.7104166666666667 | 0 |
| 0.7111111111111111 | 0 |
| 0.7118055555555555 | 0 |
| 0.7125 | 0 |
| 0.7131944444444445 | 0 |
| 0.7138888888888889 | 0 |
| 0.7145833333333332 | 0 |
| 0.7152777777777778 | 0 |
| 0.7159722222222222 | 0 |
| 0.7166666666666667 | 0 |
| 0.717361111111111 | 0 |
| 0.7180555555555556 | 0 |
| 0.71875 | 0 |
| 0.7194444444444444 | 0 |
| 0.720138888888889 | 0 |
| 0.7208333333333333 | 0 |
| 0.7215277777777778 | 0 |
| 0.7222222222222222 | 0 |
| 0.7229166666666668 | 0 |
| 0.7236111111111111 | 0 |
| 0.7243055555555555 | 0 |
| 0.725 | 0 |
| 0.7256944444444445 | 0 |
| 0.7263888888888889 | 0 |
| 0.7270833333333333 | 0 |
| 0.7277777777777777 | 0 |
| 0.7284722222222223 | 0 |
| 0.7291666666666666 | 0 |
| 0.7298611111111111 | 0 |
| 0.7305555555555556 | 0 |
| 0.7312500000000001 | 0 |
| 0.7319444444444444 | 0 |
| 0.7326388888888888 | 0 |
| 0.7333333333333334 | 0 |
| 0.7340277777777778 | 0 |
| 0.7347222222222222 | 0 |
| 0.7354166666666666 | 0 |
| 0.7361111111111112 | 0 |
| 0.7368055555555556 | 0 |
| 0.7374999999999999 | 0 |
| 0.7381944444444444 | 0 |
| 0.7388888888888889 | 0 |
| 0.7395833333333334 | 0 |
| 0.7402777777777777 | 0 |
| 0.7409722222222223 | 0 |
| 0.7416666666666667 | 0 |
| 0.7423611111111111 | 0 |
| 0.7430555555555555 | 0 |
| 0.74375 | 0 |
| 0.7444444444444445 | 0 |
| 0.7451388888888889 | 0 |
| 0.7458333333333332 | 0 |
| 0.7465277777777778 | 0 |
| 0.7472222222222222 | 0 |
| 0.7479166666666667 | 0 |
| 0.748611111111111 | 0 |
| 0.7493055555555556 | 0 |
| 0.75 | 0 |
| 0.7506944444444444 | 0 |
| 0.751388888888889 | 0 |
| 0.7520833333333333 | 0 |
| 0.7527777777777778 | 0 |
| 0.7534722222222222 | 0 |
| 0.7541666666666668 | 0 |
| 0.7548611111111111 | 0 |
| 0.7555555555555555 | 0 |
| 0.75625 | 0 |
| 0.7569444444444445 | 0 |
| 0.7576388888888889 | 0 |
| 0.7583333333333333 | 0 |
| 0.7590277777777777 | 0 |
| 0.7597222222222223 | 0 |
| 0.7604166666666666 | 0 |
| 0.7611111111111111 | 0 |
| 0.7618055555555556 | 0 |
| 0.7625000000000001 | 0 |
| 0.7631944444444444 | 0 |
| 0.7638888888888888 | 0 |
| 0.7645833333333334 | 0 |
| 0.7652777777777778 | 0 |
| 0.7659722222222222 | 0 |
| 0.7666666666666666 | 0 |
| 0.7673611111111112 | 0 |
| 0.7680555555555556 | 0 |
| 0.7687499999999999 | 0 |
| 0.7694444444444444 | 0 |
| 0.7701388888888889 | 0 |
| 0.7708333333333334 | 0 |
| 0.7715277777777777 | 0 |
| 0.7722222222222223 | 0 |
| 0.7729166666666667 | 0 |
| 0.7736111111111111 | 0 |
| 0.7743055555555555 | 0 |
| 0.775 | 0 |
| 0.7756944444444445 | 0 |
| 0.7763888888888889 | 0 |
| 0.7770833333333332 | 0 |
| 0.7777777777777778 | 0 |
| 0.7784722222222222 | 0 |
| 0.7791666666666667 | 0 |
| 0.779861111111111 | 0 |
| 0.7805555555555556 | 0 |
| 0.78125 | 0 |
| 0.7819444444444444 | 0 |
| 0.782638888888889 | 0 |
| 0.7833333333333333 | 0 |
| 0.7840277777777778 | 0 |
| 0.7847222222222222 | 0 |
| 0.7854166666666668 | 0 |
| 0.7861111111111111 | 0 |
| 0.7868055555555555 | 0 |
| 0.7875 | 0 |
| 0.7881944444444445 | 0 |
| 0.7888888888888889 | 0 |
| 0.7895833333333333 | 0 |
| 0.7902777777777777 | 0 |
| 0.7909722222222223 | 0 |
| 0.7916666666666666 | 0 |
| 0.7923611111111111 | 0 |
| 0.7930555555555556 | 0 |
| 0.7937500000000001 | 0 |
| 0.7944444444444444 | 0 |
| 0.7951388888888888 | 0 |
| 0.7958333333333334 | 0 |
| 0.7965277777777778 | 0 |
| 0.7972222222222222 | 0 |
| 0.7979166666666666 | 0 |
| 0.7986111111111112 | 0 |
| 0.7993055555555556 | 0 |
| 0.7999999999999999 | 0 |
| 0.8006944444444444 | 0 |
| 0.8013888888888889 | 0 |
| 0.8020833333333334 | 0 |
| 0.8027777777777777 | 0 |
| 0.8034722222222223 | 0 |
| 0.8041666666666667 | 0 |
| 0.8048611111111111 | 0 |
| 0.8055555555555555 | 0 |
| 0.80625 | 0 |
| 0.8069444444444445 | 0 |
| 0.8076388888888889 | 0 |
| 0.8083333333333332 | 0 |
| 0.8090277777777778 | 0 |
| 0.8097222222222222 | 0 |
| 0.8104166666666667 | 0 |
| 0.811111111111111 | 0 |
| 0.8118055555555556 | 0 |
| 0.8125 | 0 |
| 0.8131944444444444 | 0 |
| 0.813888888888889 | 0 |
| 0.8145833333333333 | 0 |
| 0.8152777777777778 | 0 |
| 0.8159722222222222 | 0 |
| 0.8166666666666668 | 0 |
| 0.8173611111111111 | 0 |
| 0.8180555555555555 | 0 |
| 0.81875 | 0 |
| 0.8194444444444445 | 0 |
| 0.8201388888888889 | 0 |
| 0.8208333333333333 | 0 |
| 0.8215277777777777 | 0 |
| 0.8222222222222223 | 0 |
| 0.8229166666666666 | 0 |
| 0.8236111111111111 | 0 |
| 0.8243055555555556 | 0 |
| 0.8250000000000001 | 0 |
| 0.8256944444444444 | 0 |
| 0.8263888888888888 | 0 |
| 0.8270833333333334 | 0 |
| 0.8277777777777778 | 0 |
| 0.8284722222222222 | 0 |
| 0.8291666666666666 | 0 |
| 0.8298611111111112 | 0 |
| 0.8305555555555556 | 0 |
| 0.8312499999999999 | 0 |
| 0.8319444444444444 | 0 |
| 0.8326388888888889 | 0 |
| 0.8333333333333334 | 0 |
| 0.8340277777777777 | 0 |
| 0.8347222222222223 | 0 |
| 0.8354166666666667 | 0 |
| 0.8361111111111111 | 0 |
| 0.8368055555555555 | 0 |
| 0.8375 | 0 |
| 0.8381944444444445 | 0 |
| 0.8388888888888889 | 0 |
| 0.8395833333333332 | 0 |
| 0.8402777777777778 | 0 |
| 0.8409722222222222 | 0 |
| 0.8416666666666667 | 0 |
| 0.842361111111111 | 0 |
| 0.8430555555555556 | 0 |
| 0.84375 | 0 |
| 0.8444444444444444 | 0 |
| 0.845138888888889 | 0 |
| 0.8458333333333333 | 0 |
| 0.8465277777777778 | 0 |
| 0.8472222222222222 | 0 |
| 0.8479166666666668 | 0 |
| 0.8486111111111111 | 0 |
| 0.8493055555555555 | 0 |
| 0.85 | 0 |
| 0.8506944444444445 | 0 |
| 0.8513888888888889 | 0 |
| 0.8520833333333333 | 0 |
| 0.8527777777777777 | 0 |
| 0.8534722222222223 | 0 |
| 0.8541666666666666 | 0 |
| 0.8548611111111111 | 0 |
| 0.8555555555555556 | 0 |
| 0.8562500000000001 | 0 |
| 0.8569444444444444 | 0 |
| 0.8576388888888888 | 0 |
| 0.8583333333333334 | 0 |
| 0.8590277777777778 | 0 |
| 0.8597222222222222 | 0 |
| 0.8604166666666666 | 0 |
| 0.8611111111111112 | 0 |
| 0.8618055555555556 | 0 |
| 0.8624999999999999 | 0 |
| 0.8631944444444444 | 0 |
| 0.8638888888888889 | 0 |
| 0.8645833333333334 | 0 |
| 0.8652777777777777 | 0 |
| 0.8659722222222223 | 0 |
| 0.8666666666666667 | 0 |
| 0.8673611111111111 | 0 |
| 0.8680555555555555 | 0 |
| 0.86875 | 0 |
| 0.8694444444444445 | 0 |
| 0.8701388888888889 | 0 |
| 0.8708333333333332 | 0 |
| 0.8715277777777778 | 0 |
| 0.8722222222222222 | 0 |
| 0.8729166666666667 | 0 |
| 0.873611111111111 | 0 |
| 0.8743055555555556 | 0 |
| 0.875 | 0 |
| 0.8756944444444444 | 0 |
| 0.876388888888889 | 0 |
| 0.8770833333333333 | 0 |
| 0.8777777777777778 | 0 |
| 0.8784722222222222 | 0 |
| 0.8791666666666668 | 0 |
| 0.8798611111111111 | 0 |
| 0.8805555555555555 | 0 |
| 0.88125 | 0 |
| 0.8819444444444445 | 0 |
| 0.8826388888888889 | 0 |
| 0.8833333333333333 | 0 |
| 0.8840277777777777 | 0 |
| 0.8847222222222223 | 0 |
| 0.8854166666666666 | 0 |
| 0.8861111111111111 | 0 |
| 0.8868055555555556 | 0 |
| 0.8875000000000001 | 0 |
| 0.8881944444444444 | 0 |
| 0.8888888888888888 | 0 |
| 0.8895833333333334 | 0 |
| 0.8902777777777778 | 0 |
| 0.8909722222222222 | 0 |
| 0.8916666666666666 | 0 |
| 0.8923611111111112 | 0 |
| 0.8930555555555556 | 0 |
| 0.8937499999999999 | 0 |
| 0.8944444444444444 | 0 |
| 0.8951388888888889 | 0 |
| 0.8958333333333334 | 0 |
| 0.8965277777777777 | 0 |
| 0.8972222222222223 | 0 |
| 0.8979166666666667 | 0 |
| 0.8986111111111111 | 0 |
| 0.8993055555555555 | 0 |
| 0.9 | 0 |
| 0.9006944444444445 | 0 |
| 0.9013888888888889 | 0 |
| 0.9020833333333332 | 0 |
| 0.9027777777777778 | 0 |
| 0.9034722222222222 | 0 |
| 0.9041666666666667 | 0 |
| 0.904861111111111 | 0 |
| 0.9055555555555556 | 0 |
| 0.90625 | 0 |
| 0.9069444444444444 | 0 |
| 0.907638888888889 | 0 |
| 0.9083333333333333 | 0 |
| 0.9090277777777778 | 0 |
| 0.9097222222222222 | 0 |
| 0.9104166666666668 | 0 |
| 0.9111111111111111 | 0 |
| 0.9118055555555555 | 0 |
| 0.9125 | 0 |
| 0.9131944444444445 | 0 |
| 0.9138888888888889 | 0 |
| 0.9145833333333333 | 0 |
| 0.9152777777777777 | 0 |
| 0.9159722222222223 | 0 |
| 0.9166666666666666 | 0 |
| 0.9173611111111111 | 0 |
| 0.9180555555555556 | 0 |
| 0.9187500000000001 | 0 |
| 0.9194444444444444 | 0 |
| 0.9201388888888888 | 0 |
| 0.9208333333333334 | 0 |
| 0.9215277777777778 | 0 |
| 0.9222222222222222 | 0 |
| 0.9229166666666666 | 0 |
| 0.9236111111111112 | 0 |
| 0.9243055555555556 | 0 |
| 0.9249999999999999 | 0 |
| 0.9256944444444444 | 0 |
| 0.9263888888888889 | 0 |
| 0.9270833333333334 | 0 |
| 0.9277777777777777 | 0 |
| 0.9284722222222223 | 0 |
| 0.9291666666666667 | 0 |
| 0.9298611111111111 | 0 |
| 0.9305555555555555 | 0 |
| 0.93125 | 0 |
| 0.9319444444444445 | 0 |
| 0.9326388888888889 | 0 |
| 0.9333333333333332 | 0 |
| 0.9340277777777778 | 0 |
| 0.9347222222222222 | 0 |
| 0.9354166666666667 | 0 |
| 0.936111111111111 | 0 |
| 0.9368055555555556 | 0 |
| 0.9375 | 0 |
| 0.9381944444444444 | 0 |
| 0.938888888888889 | 0 |
| 0.9395833333333333 | 0 |
| 0.9402777777777778 | 0 |
| 0.9409722222222222 | 0 |
| 0.9416666666666668 | 0 |
| 0.9423611111111111 | 0 |
| 0.9430555555555555 | 0 |
| 0.94375 | 0 |
| 0.9444444444444445 | 0 |
| 0.9451388888888889 | 0 |
| 0.9458333333333333 | 0 |
| 0.9465277777777777 | 0 |
| 0.9472222222222223 | 0 |
| 0.9479166666666666 | 0 |
| 0.9486111111111111 | 0 |
| 0.9493055555555556 | 0 |
| 0.9500000000000001 | 0 |
| 0.9506944444444444 | 0 |
| 0.9513888888888888 | 0 |
| 0.9520833333333334 | 0 |
| 0.9527777777777778 | 0 |
| 0.9534722222222222 | 0 |
| 0.9541666666666666 | 0 |
| 0.9548611111111112 | 0 |
| 0.9555555555555556 | 0 |
| 0.9562499999999999 | 0 |
| 0.9569444444444444 | 0 |
| 0.9576388888888889 | 0 |
| 0.9583333333333334 | 0 |
| 0.9590277777777777 | 0 |
| 0.9597222222222223 | 0 |
| 0.9604166666666667 | 0 |
| 0.9611111111111111 | 0 |
| 0.9618055555555555 | 0 |
| 0.9625 | 0 |
| 0.9631944444444445 | 0 |
| 0.9638888888888889 | 0 |
| 0.9645833333333332 | 0 |
| 0.9652777777777778 | 0 |
| 0.9659722222222222 | 0 |
| 0.9666666666666667 | 0 |
| 0.967361111111111 | 0 |
| 0.9680555555555556 | 0 |
| 0.96875 | 0 |
| 0.9694444444444444 | 0 |
| 0.970138888888889 | 0 |
| 0.9708333333333333 | 0 |
| 0.9715277777777778 | 0 |
| 0.9722222222222222 | 0 |
| 0.9729166666666668 | 0 |
| 0.9736111111111111 | 0 |
| 0.9743055555555555 | 0 |
| 0.975 | 0 |
| 0.9756944444444445 | 0 |
| 0.9763888888888889 | 0 |
| 0.9770833333333333 | 0 |
| 0.9777777777777777 | 0 |
| 0.9784722222222223 | 0 |
| 0.9791666666666666 | 0 |
| 0.9798611111111111 | 0 |
| 0.9805555555555556 | 0 |
| 0.9812500000000001 | 0 |
| 0.9819444444444444 | 0 |
| 0.9826388888888888 | 0 |
| 0.9833333333333334 | 0 |
| 0.9840277777777778 | 0 |
| 0.9847222222222222 | 0 |
| 0.9854166666666666 | 0 |
| 0.9861111111111112 | 0 |
| 0.9868055555555556 | 0 |
| 0.9874999999999999 | 0 |
| 0.9881944444444444 | 0 |
| 0.9888888888888889 | 0 |
| 0.9895833333333334 | 0 |
| 0.9902777777777777 | 0 |
| 0.9909722222222223 | 0 |
| 0.9916666666666667 | 0 |
| 0.9923611111111111 | 0 |
| 0.9930555555555555 | 0 |
| 0.99375 | 0 |
| 0.9944444444444445 | 0 |
| 0.9951388888888889 | 0 |
| 0.9958333333333332 | 0 |
| 0.9965277777777778 | 0 |
| 0.9972222222222222 | 0 |
| 0.9979166666666667 | 0 |
| 0.998611111111111 | 0 |
| 0.9993055555555556 | 0 |